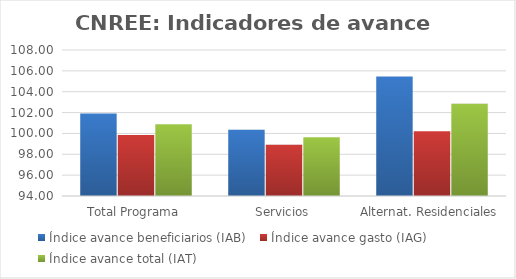
| Category | Índice avance beneficiarios (IAB)  | Índice avance gasto (IAG) | Índice avance total (IAT)  |
|---|---|---|---|
| Total Programa | 101.919 | 99.854 | 100.886 |
| Servicios | 100.341 | 98.918 | 99.63 |
| Alternat. Residenciales | 105.46 | 100.217 | 102.838 |